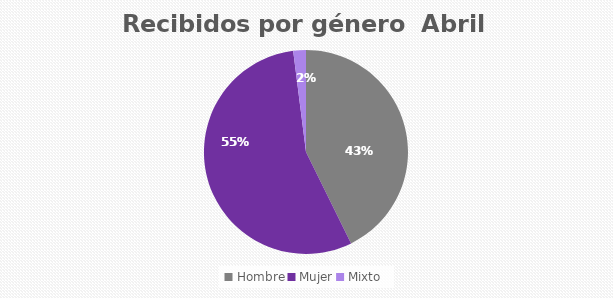
| Category | Recibidos por género  ABRIL |
|---|---|
| Hombre | 85 |
| Mujer | 110 |
| Mixto | 4 |